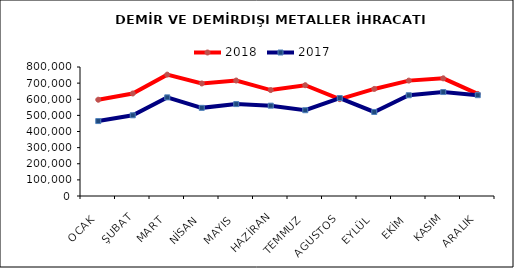
| Category | 2018 | 2017 |
|---|---|---|
| OCAK | 597090.949 | 464679.325 |
| ŞUBAT | 635664.853 | 500561.753 |
| MART | 752666.957 | 611659.56 |
| NİSAN | 698004.588 | 546671.352 |
| MAYIS | 716099.601 | 570053.03 |
| HAZİRAN | 656961.717 | 560114.409 |
| TEMMUZ | 687025.769 | 532005.901 |
| AGUSTOS | 600615.203 | 607603.944 |
| EYLÜL | 663982.6 | 521152.862 |
| EKİM | 715591.262 | 624817.501 |
| KASIM | 729729.282 | 644682.235 |
| ARALIK | 632952.757 | 625200.642 |